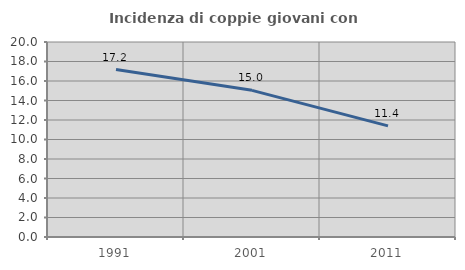
| Category | Incidenza di coppie giovani con figli |
|---|---|
| 1991.0 | 17.175 |
| 2001.0 | 15.041 |
| 2011.0 | 11.4 |